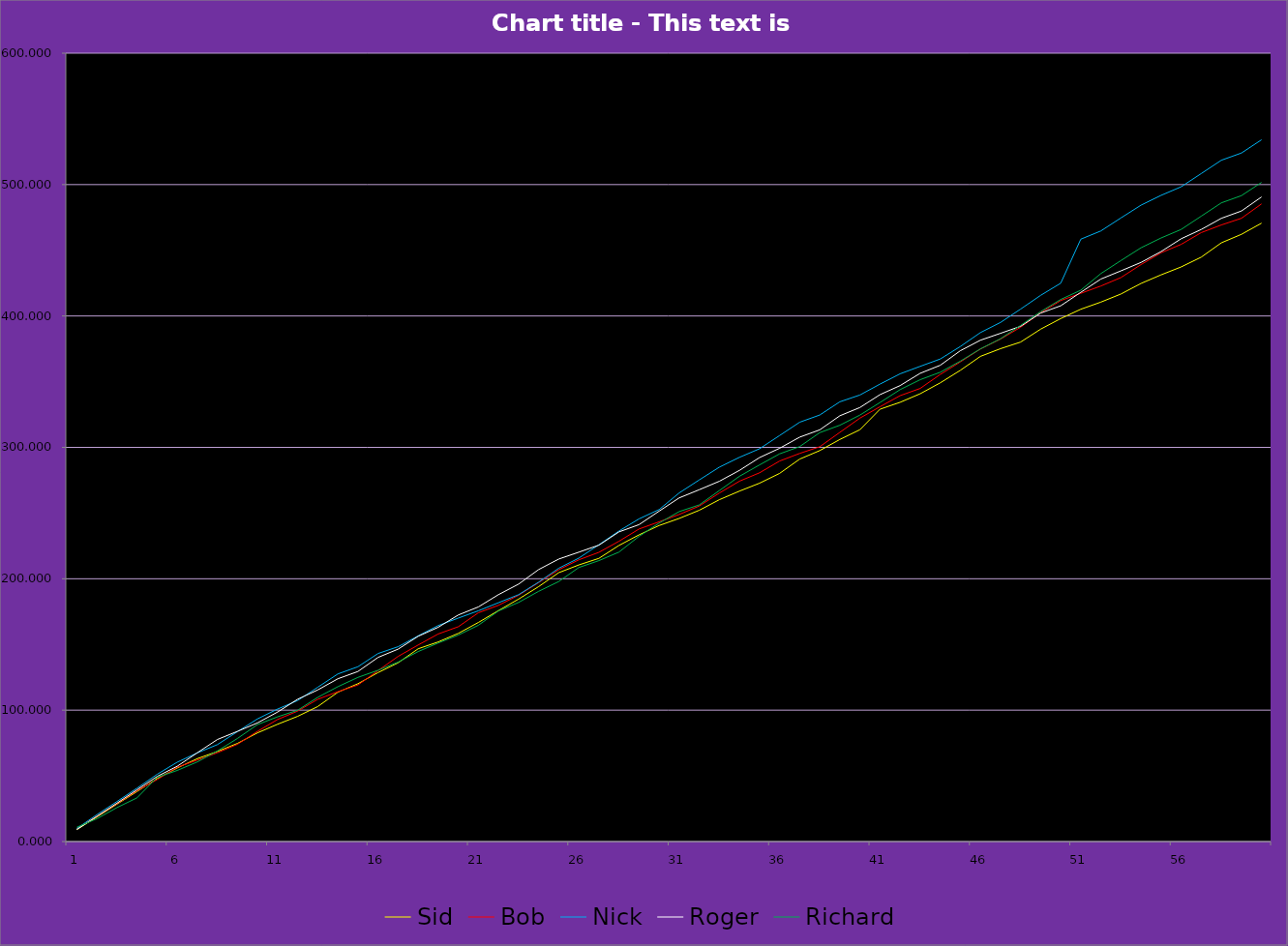
| Category | Sid | Bob | Nick | Roger | Richard |
|---|---|---|---|---|---|
| 0 | 9.112 | 9.902 | 9.903 | 9.095 | 10.888 |
| 1 | 18.694 | 19.224 | 20.458 | 19.196 | 17.357 |
| 2 | 28.428 | 28.824 | 30.459 | 29.201 | 25.831 |
| 3 | 38.083 | 38.768 | 40.66 | 39.439 | 33.258 |
| 4 | 47.923 | 47.185 | 51.139 | 49.519 | 48.856 |
| 5 | 55.989 | 56.522 | 60.38 | 57.294 | 54.109 |
| 6 | 63.088 | 62.011 | 67.46 | 67.557 | 60.595 |
| 7 | 68.505 | 67.576 | 73.738 | 77.635 | 68.914 |
| 8 | 74.698 | 74.008 | 83.643 | 83.864 | 78.444 |
| 9 | 82.735 | 83.901 | 93.362 | 90.295 | 89.052 |
| 10 | 89.275 | 92.894 | 100.828 | 98.567 | 94.921 |
| 11 | 95.293 | 99.287 | 107.333 | 108.324 | 99.939 |
| 12 | 102.755 | 108.248 | 117.426 | 115.391 | 109.779 |
| 13 | 113.643 | 114.039 | 127.548 | 123.867 | 117.845 |
| 14 | 120.112 | 119.129 | 133.038 | 129.423 | 124.944 |
| 15 | 128.586 | 130.064 | 143.095 | 140.122 | 130.361 |
| 16 | 136.013 | 140.907 | 148.27 | 146.431 | 136.554 |
| 17 | 146.689 | 149.581 | 156.548 | 156.221 | 144.591 |
| 18 | 151.942 | 157.991 | 164.397 | 163.099 | 151.131 |
| 19 | 158.428 | 163.498 | 170.074 | 172.448 | 157.149 |
| 20 | 166.747 | 174.135 | 175.649 | 178.566 | 164.611 |
| 21 | 175.77 | 179.776 | 181.76 | 187.917 | 175.499 |
| 22 | 184.488 | 187.482 | 187.883 | 195.918 | 181.968 |
| 23 | 194.018 | 197.068 | 197.412 | 206.989 | 190.442 |
| 24 | 204.626 | 206.845 | 207.984 | 214.981 | 197.869 |
| 25 | 210.495 | 214.414 | 215.717 | 220.241 | 208.545 |
| 26 | 215.513 | 220.119 | 225.864 | 225.575 | 213.798 |
| 27 | 225.353 | 228.536 | 236.343 | 235.655 | 220.284 |
| 28 | 233.419 | 237.873 | 245.584 | 241.205 | 232.29 |
| 29 | 240.518 | 243.362 | 252.664 | 251.468 | 242.395 |
| 30 | 245.935 | 248.927 | 265.324 | 261.546 | 251.113 |
| 31 | 252.128 | 255.359 | 275.229 | 267.775 | 256.203 |
| 32 | 260.165 | 265.252 | 284.948 | 274.206 | 267.138 |
| 33 | 266.705 | 274.245 | 292.414 | 282.478 | 277.981 |
| 34 | 272.723 | 280.638 | 298.919 | 292.235 | 286.655 |
| 35 | 280.185 | 289.599 | 309.012 | 299.302 | 295.065 |
| 36 | 291.073 | 295.39 | 319.134 | 307.778 | 300.572 |
| 37 | 297.542 | 300.48 | 324.624 | 313.334 | 311.209 |
| 38 | 306.016 | 311.415 | 334.681 | 324.033 | 316.85 |
| 39 | 313.443 | 322.258 | 339.856 | 330.342 | 324.556 |
| 40 | 329.041 | 330.932 | 348.134 | 340.132 | 334.142 |
| 41 | 334.294 | 339.342 | 355.983 | 347.01 | 343.919 |
| 42 | 340.78 | 344.849 | 361.66 | 356.359 | 351.488 |
| 43 | 349.099 | 355.486 | 367.235 | 362.477 | 357.193 |
| 44 | 358.629 | 365.072 | 376.764 | 373.548 | 365.61 |
| 45 | 369.237 | 374.849 | 387.336 | 381.54 | 374.947 |
| 46 | 375.106 | 382.418 | 395.069 | 386.8 | 382.68 |
| 47 | 380.124 | 391.418 | 405.216 | 392.134 | 392.827 |
| 48 | 389.964 | 402.418 | 415.695 | 402.214 | 403.306 |
| 49 | 398.03 | 411.755 | 424.936 | 407.764 | 412.547 |
| 50 | 405.129 | 417.244 | 458.454 | 418.027 | 419.627 |
| 51 | 410.546 | 422.809 | 464.732 | 428.105 | 432.287 |
| 52 | 416.739 | 429.241 | 474.637 | 434.334 | 442.192 |
| 53 | 424.776 | 439.134 | 484.356 | 440.765 | 451.911 |
| 54 | 431.316 | 448.127 | 491.822 | 449.037 | 459.377 |
| 55 | 437.334 | 454.52 | 498.327 | 458.794 | 465.882 |
| 56 | 444.796 | 463.481 | 508.42 | 465.861 | 475.975 |
| 57 | 455.684 | 469.272 | 518.542 | 474.337 | 486.097 |
| 58 | 462.153 | 474.362 | 524.032 | 479.893 | 491.587 |
| 59 | 470.627 | 485.297 | 534.089 | 490.592 | 501.644 |